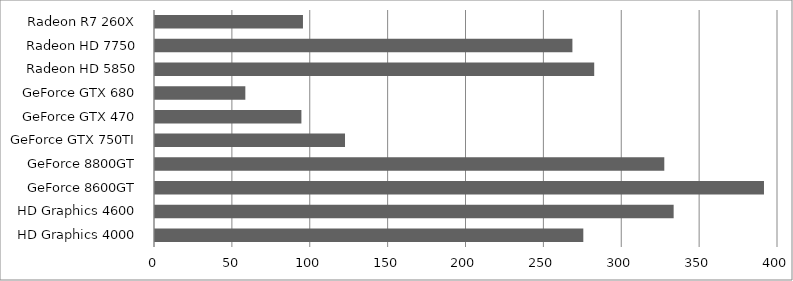
| Category | 1024 triangles per draw |
|---|---|
| HD Graphics 4000 | 275 |
| HD Graphics 4600 | 333 |
| GeForce 8600GT | 391 |
| GeForce 8800GT | 327 |
| GeForce GTX 750TI | 122 |
| GeForce GTX 470 | 94 |
| GeForce GTX 680 | 58 |
| Radeon HD 5850 | 282 |
| Radeon HD 7750 | 268 |
| Radeon R7 260X | 95 |